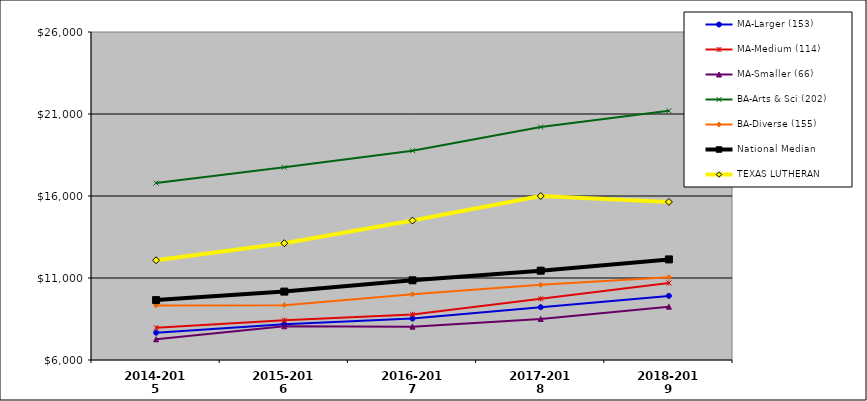
| Category | MA-Larger (153) | MA-Medium (114) | MA-Smaller (66) | BA-Arts & Sci (202) | BA-Diverse (155) | National Median |  TEXAS LUTHERAN  |
|---|---|---|---|---|---|---|---|
| 2014-2015 | 7665.796 | 7964.426 | 7262.849 | 16787.66 | 9325.741 | 9651.331 | 12082.598 |
| 2015-2016 | 8178.309 | 8422.432 | 8058.401 | 17747.36 | 9341.031 | 10170.953 | 13120.524 |
| 2016-2017 | 8527.649 | 8781.057 | 8033.268 | 18761.298 | 10007.84 | 10859.41 | 14503.602 |
| 2017-2018 | 9217.711 | 9732.866 | 8503.168 | 20204.38 | 10581.695 | 11445.61 | 15999.237 |
| 2018-2019 | 9909.725 | 10698.623 | 9249.874 | 21197.122 | 11051.2 | 12133.725 | 15639.308 |